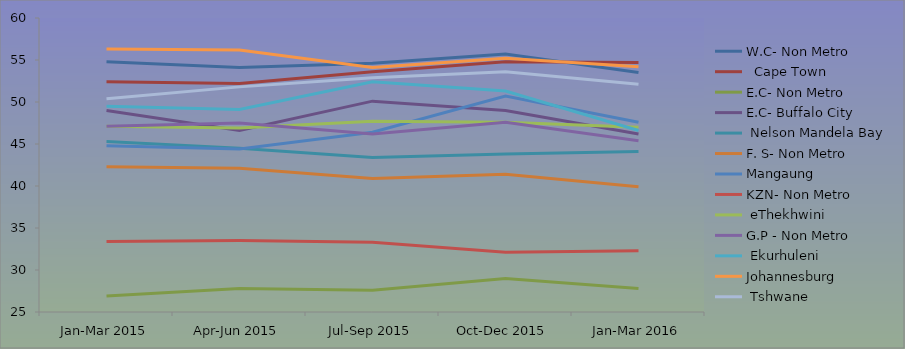
| Category | W.C- Non Metro |   Cape Town | E.C- Non Metro | E.C- Buffalo City |  Nelson Mandela Bay | F. S- Non Metro | Mangaung | KZN- Non Metro |  eThekhwini | G.P - Non Metro |  Ekurhuleni | Johannesburg |  Tshwane |
|---|---|---|---|---|---|---|---|---|---|---|---|---|---|
| Jan-Mar 2015 | 54.8 | 52.4 | 26.9 | 49 | 45.3 | 42.3 | 44.8 | 33.4 | 47.1 | 47.1 | 49.5 | 56.3 | 50.4 |
| Apr-Jun 2015 | 54.1 | 52.2 | 27.8 | 46.6 | 44.5 | 42.1 | 44.4 | 33.5 | 46.9 | 47.5 | 49.1 | 56.2 | 51.8 |
| Jul-Sep 2015 | 54.6 | 53.6 | 27.6 | 50.1 | 43.4 | 40.9 | 46.4 | 33.3 | 47.7 | 46.2 | 52.4 | 54.1 | 52.9 |
| Oct-Dec 2015 | 55.7 | 54.8 | 29 | 49 | 43.8 | 41.4 | 50.7 | 32.1 | 47.6 | 47.6 | 51.3 | 55.2 | 53.6 |
| Jan-Mar 2016 | 53.5 | 54.7 | 27.8 | 46.2 | 44.1 | 39.9 | 47.6 | 32.3 | 47 | 45.4 | 46.6 | 54.2 | 52.1 |